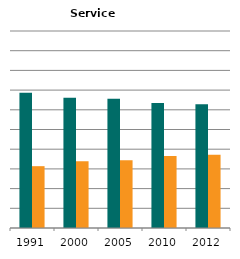
| Category | Male | Female |
|---|---|---|
| 1991.0 | 0.686 | 0.314 |
| 2000.0 | 0.661 | 0.339 |
| 2005.0 | 0.656 | 0.344 |
| 2010.0 | 0.635 | 0.365 |
| 2012.0 | 0.628 | 0.372 |